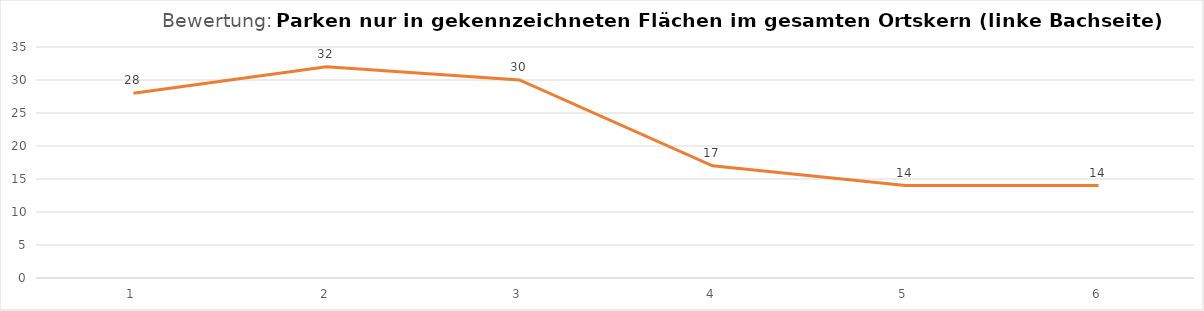
| Category | Series 0 |
|---|---|
| 1.0 | 28 |
| 2.0 | 32 |
| 3.0 | 30 |
| 4.0 | 17 |
| 5.0 | 14 |
| 6.0 | 14 |